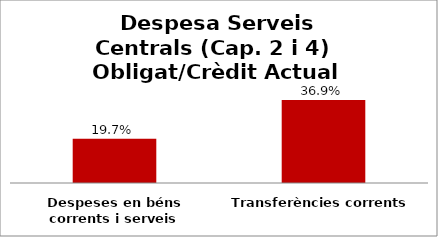
| Category | Series 0 |
|---|---|
| Despeses en béns corrents i serveis | 0.197 |
| Transferències corrents | 0.369 |